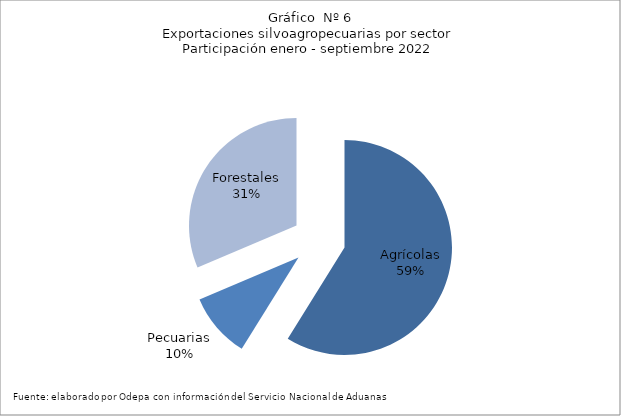
| Category | Series 0 |
|---|---|
| Agrícolas | 7852874 |
| Pecuarias | 1304618 |
| Forestales | 4186362 |